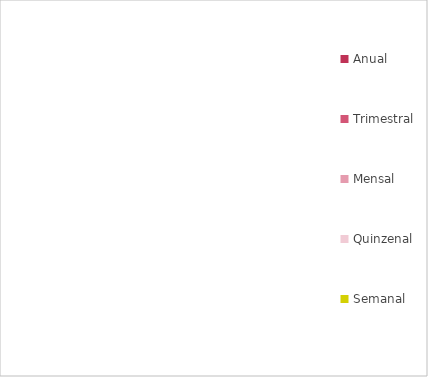
| Category | Series 0 |
|---|---|
| Anual | 0 |
| Trimestral | 0 |
| Mensal | 0 |
| Quinzenal | 0 |
| Semanal | 0 |